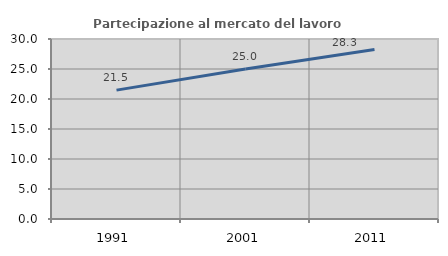
| Category | Partecipazione al mercato del lavoro  femminile |
|---|---|
| 1991.0 | 21.478 |
| 2001.0 | 25 |
| 2011.0 | 28.267 |